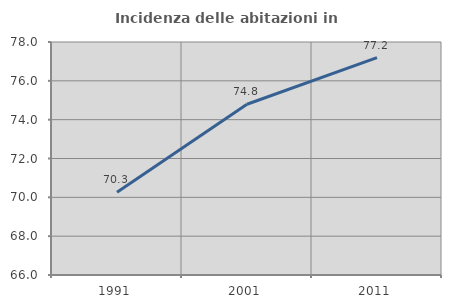
| Category | Incidenza delle abitazioni in proprietà  |
|---|---|
| 1991.0 | 70.259 |
| 2001.0 | 74.794 |
| 2011.0 | 77.199 |